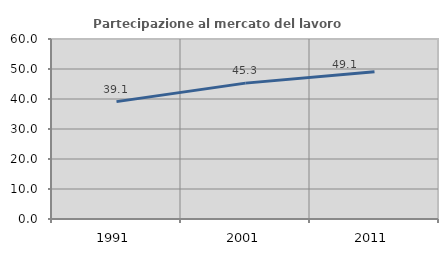
| Category | Partecipazione al mercato del lavoro  femminile |
|---|---|
| 1991.0 | 39.125 |
| 2001.0 | 45.291 |
| 2011.0 | 49.11 |